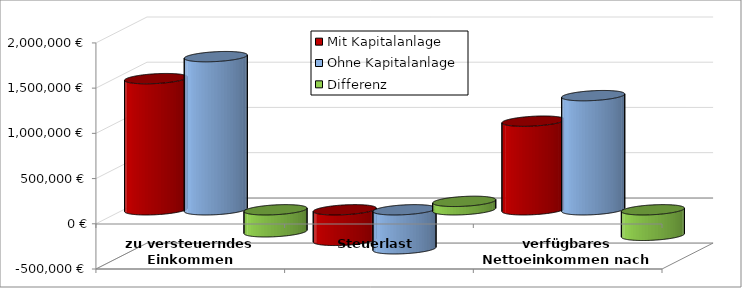
| Category | Mit Kapitalanlage | Ohne Kapitalanlage | Differenz |
|---|---|---|---|
| zu versteuerndes Einkommen | 1450336.207 | 1693609.311 | -243273.104 |
| Steuerlast | -337896.31 | -431231.9 | 93335.59 |
| verfügbares Nettoeinkommen nach Steuern | 980127.726 | 1262377.411 | -282249.685 |